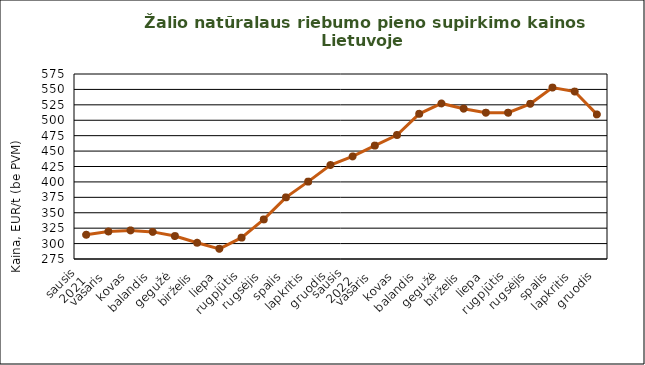
| Category | Series 0 |
|---|---|
| 0 | 314.31 |
| 1 | 319.61 |
| 2 | 321.34 |
| 3 | 318.95 |
| 4 | 312.21 |
| 5 | 301.42 |
| 6 | 291.49 |
| 7 | 309.65 |
| 8 | 339.16 |
| 9 | 374.96 |
| 10 | 400.5 |
| 11 | 427.35 |
| 12 | 441.34 |
| 13 | 458.91 |
| 14 | 476.1 |
| 15 | 510.47 |
| 16 | 527.27 |
| 17 | 518.77 |
| 18 | 512.18 |
| 19 | 512.16 |
| 20 | 526.62 |
| 21 | 552.95 |
| 22 | 546.51 |
| 23 | 509.5 |